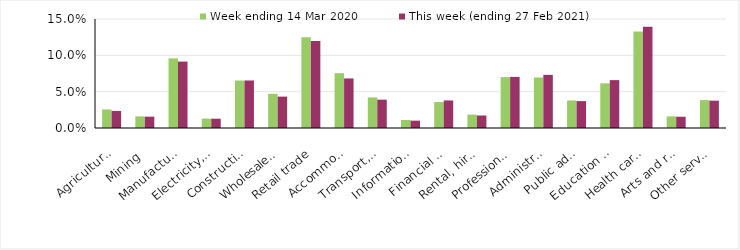
| Category | Week ending 14 Mar 2020 | This week (ending 27 Feb 2021) |
|---|---|---|
| Agriculture, forestry and fishing | 0.026 | 0.024 |
| Mining | 0.016 | 0.016 |
| Manufacturing | 0.096 | 0.091 |
| Electricity, gas, water and waste services | 0.013 | 0.013 |
| Construction | 0.065 | 0.065 |
| Wholesale trade | 0.047 | 0.043 |
| Retail trade | 0.125 | 0.12 |
| Accommodation and food services | 0.075 | 0.068 |
| Transport, postal and warehousing | 0.042 | 0.039 |
| Information media and telecommunications | 0.011 | 0.01 |
| Financial and insurance services | 0.036 | 0.038 |
| Rental, hiring and real estate services | 0.018 | 0.017 |
| Professional, scientific and technical services | 0.07 | 0.07 |
| Administrative and support services | 0.07 | 0.073 |
| Public administration and safety | 0.038 | 0.037 |
| Education and training | 0.062 | 0.066 |
| Health care and social assistance | 0.133 | 0.14 |
| Arts and recreation services | 0.016 | 0.016 |
| Other services | 0.038 | 0.038 |